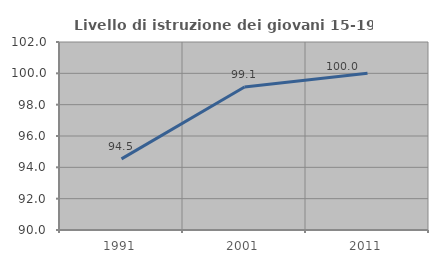
| Category | Livello di istruzione dei giovani 15-19 anni |
|---|---|
| 1991.0 | 94.539 |
| 2001.0 | 99.123 |
| 2011.0 | 100 |